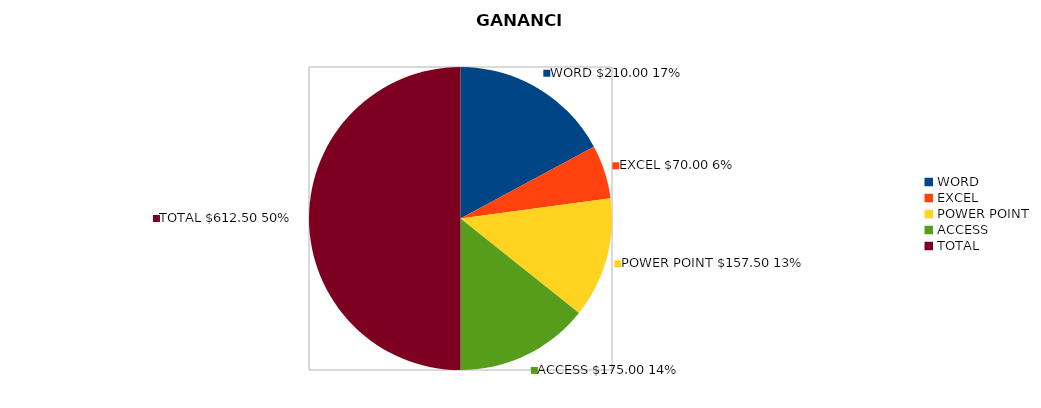
| Category | LUNES |
|---|---|
| WORD | 210 |
| EXCEL | 70 |
| POWER POINT | 157.5 |
| ACCESS | 175 |
| TOTAL | 612.5 |